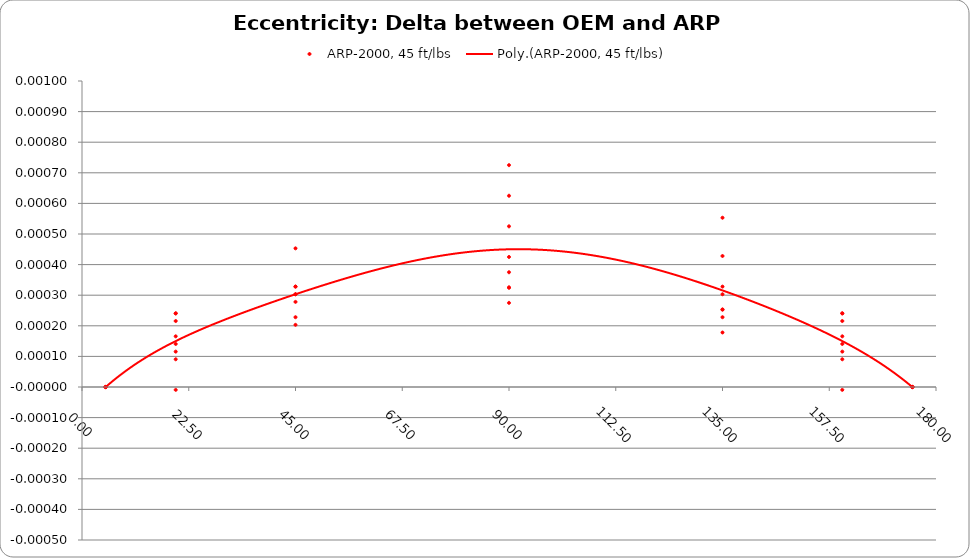
| Category | ARP-2000, 45 ft/lbs |
|---|---|
| 5.0 | 0 |
| 5.0 | 0 |
| 5.0 | 0 |
| 5.0 | 0 |
| 5.0 | 0 |
| 5.0 | 0 |
| 5.0 | 0 |
| 5.0 | 0 |
| 19.75 | 0 |
| 19.75 | 0 |
| 19.75 | 0 |
| 19.75 | 0 |
| 19.75 | 0 |
| 19.75 | 0 |
| 19.75 | 0 |
| 19.75 | 0 |
| 45.0 | 0 |
| 45.0 | 0 |
| 45.0 | 0 |
| 45.0 | 0 |
| 45.0 | 0 |
| 45.0 | 0 |
| 45.0 | 0 |
| 45.0 | 0 |
| 90.0 | 0 |
| 90.0 | 0 |
| 90.0 | 0 |
| 90.0 | 0 |
| 90.0 | 0.001 |
| 90.0 | 0 |
| 90.0 | 0.001 |
| 90.0 | 0.001 |
| 135.0 | 0 |
| 135.0 | 0 |
| 135.0 | 0 |
| 135.0 | 0 |
| 135.0 | 0 |
| 135.0 | 0 |
| 135.0 | 0 |
| 135.0 | 0.001 |
| 160.25 | 0 |
| 160.25 | 0 |
| 160.25 | 0 |
| 160.25 | 0 |
| 160.25 | 0 |
| 160.25 | 0 |
| 160.25 | 0 |
| 160.25 | 0 |
| 175.0 | 0 |
| 175.0 | 0 |
| 175.0 | 0 |
| 175.0 | 0 |
| 175.0 | 0 |
| 175.0 | 0 |
| 175.0 | 0 |
| 175.0 | 0 |